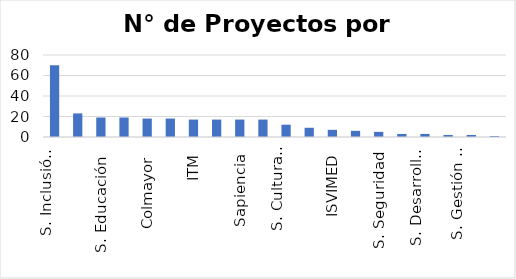
| Category | Proyectos |
|---|---|
| S. Inclusión Social | 70 |
| INDER | 23 |
| S. Educación  | 19 |
| S. Salud | 19 |
| Colmayor  | 18 |
| S. Medio ambiente | 18 |
| ITM | 17 |
| Pascual Bravo | 17 |
| Sapiencia | 17 |
| S. Participación Ciudadana | 17 |
| S. Cultura Ciudadana | 12 |
| S. Juventud | 9 |
| ISVIMED | 7 |
| S. Infraestructura | 6 |
| S. Seguridad | 5 |
| S. Comunicaciones | 3 |
| S. Desarrollo económico | 3 |
| DAGRD | 2 |
| S. Gestión y Control Territorial | 2 |
| S. de las mujeres | 1 |